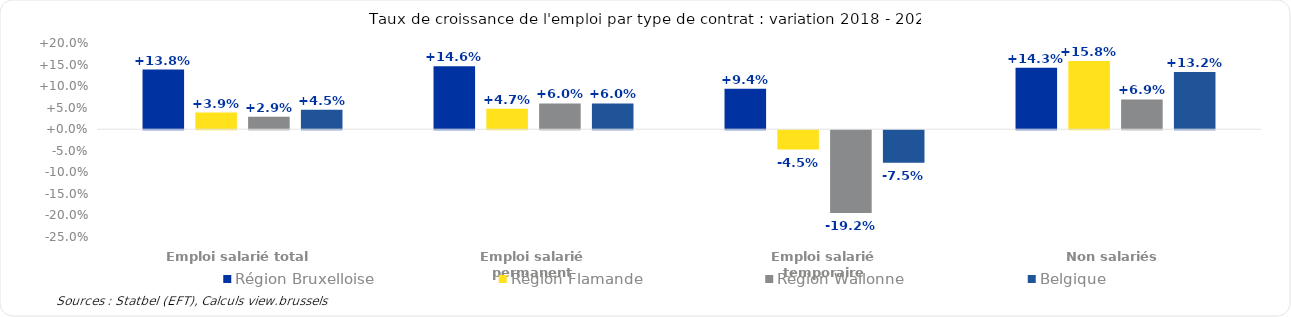
| Category | Région Bruxelloise | Région Flamande | Région Wallonne | Belgique |
|---|---|---|---|---|
| Emploi salarié total | 0.138 | 0.039 | 0.029 | 0.045 |
| Emploi salarié permanent | 0.146 | 0.047 | 0.06 | 0.06 |
| Emploi salarié temporaire | 0.094 | -0.045 | -0.192 | -0.075 |
| Non salariés | 0.143 | 0.158 | 0.069 | 0.132 |